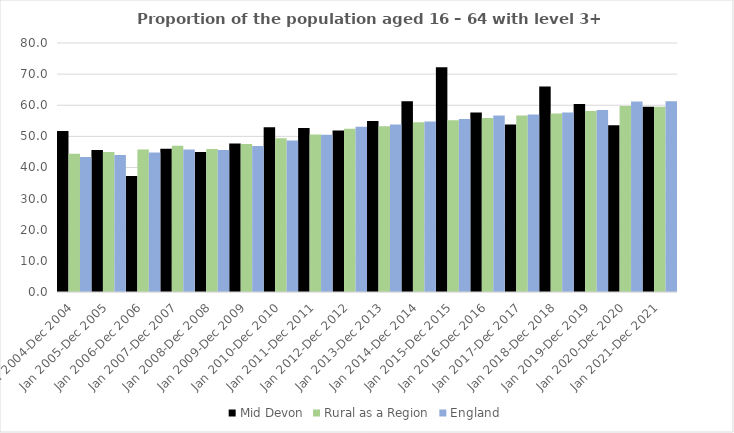
| Category | Mid Devon | Rural as a Region | England |
|---|---|---|---|
| Jan 2004-Dec 2004 | 51.7 | 44.405 | 43.4 |
| Jan 2005-Dec 2005 | 45.6 | 44.973 | 44 |
| Jan 2006-Dec 2006 | 37.3 | 45.774 | 44.8 |
| Jan 2007-Dec 2007 | 46 | 46.968 | 45.8 |
| Jan 2008-Dec 2008 | 45 | 45.964 | 45.6 |
| Jan 2009-Dec 2009 | 47.7 | 47.59 | 46.9 |
| Jan 2010-Dec 2010 | 52.9 | 49.362 | 48.7 |
| Jan 2011-Dec 2011 | 52.7 | 50.602 | 50.5 |
| Jan 2012-Dec 2012 | 51.9 | 52.439 | 53.1 |
| Jan 2013-Dec 2013 | 54.9 | 53.276 | 53.8 |
| Jan 2014-Dec 2014 | 61.3 | 54.57 | 54.8 |
| Jan 2015-Dec 2015 | 72.2 | 55.16 | 55.6 |
| Jan 2016-Dec 2016 | 57.7 | 55.941 | 56.7 |
| Jan 2017-Dec 2017 | 53.8 | 56.689 | 57 |
| Jan 2018-Dec 2018 | 66 | 57.389 | 57.7 |
| Jan 2019-Dec 2019 | 60.4 | 58.147 | 58.5 |
| Jan 2020-Dec 2020 | 53.6 | 59.771 | 61.2 |
| Jan 2021-Dec 2021 | 59.5 | 59.54 | 61.3 |